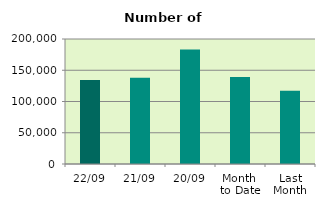
| Category | Series 0 |
|---|---|
| 22/09 | 134310 |
| 21/09 | 138174 |
| 20/09 | 183006 |
| Month 
to Date | 139127.25 |
| Last
Month | 117090.273 |